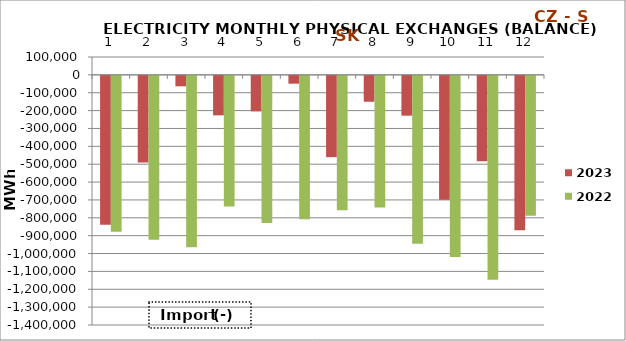
| Category | 2023 | 2022 |
|---|---|---|
| 0 | -833306.575 | -871895.95 |
| 1 | -485281.425 | -916818.85 |
| 2 | -58456.875 | -958606.05 |
| 3 | -220977.575 | -731552.6 |
| 4 | -198817.625 | -823678.25 |
| 5 | -43795.75 | -801866.15 |
| 6 | -454922.475 | -751923.41 |
| 7 | -144924.45 | -736515.35 |
| 8 | -222753.975 | -939380.875 |
| 9 | -692990.325 | -1013315.95 |
| 10 | -477732.55 | -1141454.1 |
| 11 | -863780.95 | -782718.05 |